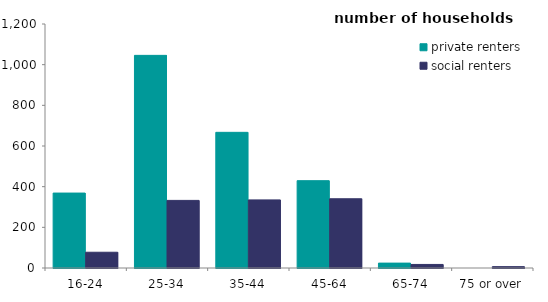
| Category | private renters | social renters |
|---|---|---|
| 16-24 | 368.543 | 77.529 |
| 25-34 | 1045.701 | 332.486 |
| 35-44 | 667.226 | 334.918 |
| 45-64 | 429.46 | 340.549 |
| 65-74 | 23.988 | 17.496 |
| 75 or over | 0 | 6.762 |